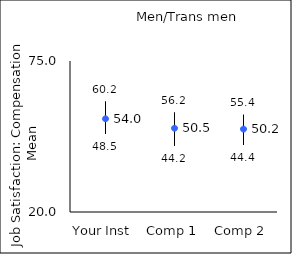
| Category | 25th percentile | 75th percentile | Mean |
|---|---|---|---|
| Your Inst | 48.5 | 60.2 | 53.96 |
| Comp 1 | 44.2 | 56.2 | 50.51 |
| Comp 2 | 44.4 | 55.4 | 50.2 |